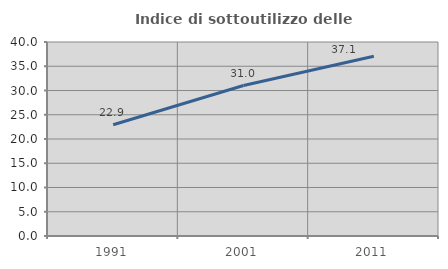
| Category | Indice di sottoutilizzo delle abitazioni  |
|---|---|
| 1991.0 | 22.931 |
| 2001.0 | 31.028 |
| 2011.0 | 37.074 |